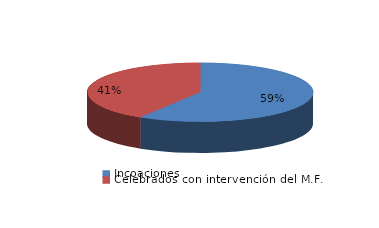
| Category | Series 0 |
|---|---|
| Incoaciones | 1460 |
| Celebrados con intervención del M.F. | 1024 |